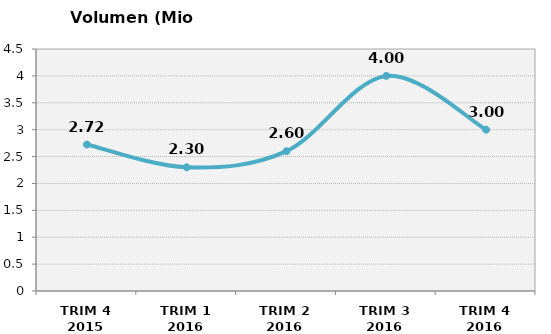
| Category | Volumen (Mio consumiciones) |
|---|---|
| TRIM 4 2015 | 2.724 |
| TRIM 1 2016 | 2.3 |
| TRIM 2 2016 | 2.6 |
| TRIM 3 2016 | 4 |
| TRIM 4 2016 | 3 |